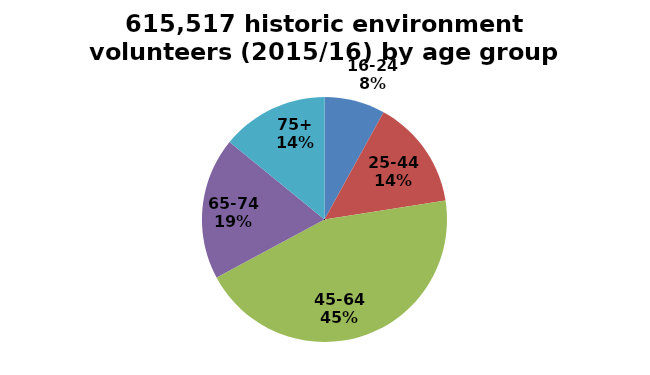
| Category | Series 0 |
|---|---|
| 16-24 | 0.08 |
| 25-44 | 0.145 |
| 45-64 | 0.446 |
| 65-74 | 0.187 |
| 75+ | 0.141 |